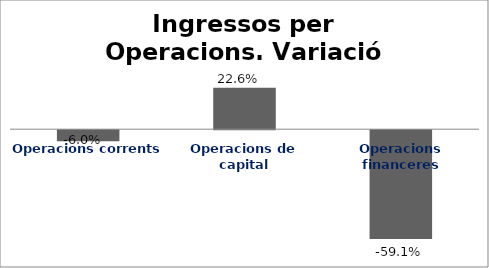
| Category | Series 0 |
|---|---|
| Operacions corrents | -0.06 |
| Operacions de capital | 0.226 |
| Operacions financeres | -0.591 |